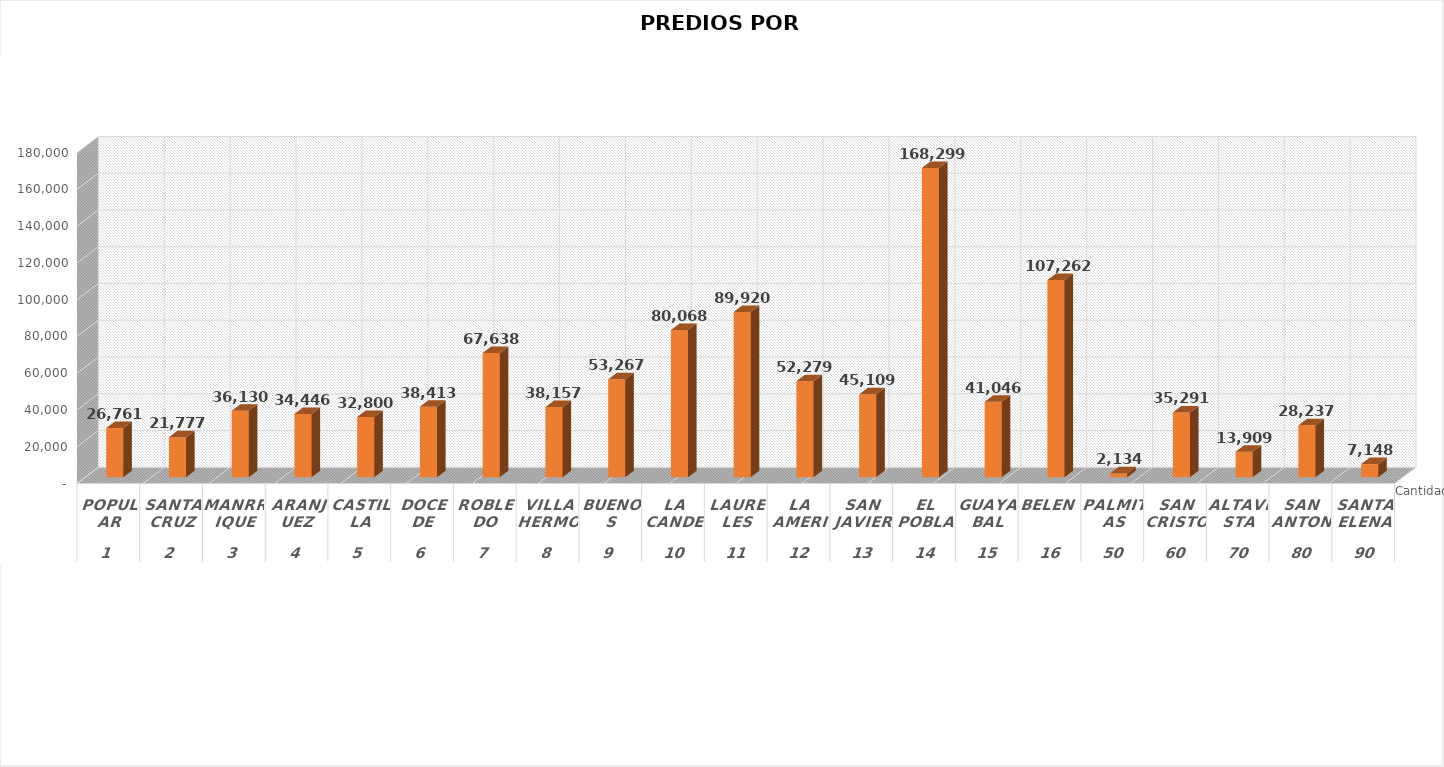
| Category | Cantidad de Predios |
|---|---|
| 0 | 26761 |
| 1 | 21777 |
| 2 | 36130 |
| 3 | 34446 |
| 4 | 32800 |
| 5 | 38413 |
| 6 | 67638 |
| 7 | 38157 |
| 8 | 53267 |
| 9 | 80068 |
| 10 | 89920 |
| 11 | 52279 |
| 12 | 45109 |
| 13 | 168299 |
| 14 | 41046 |
| 15 | 107262 |
| 16 | 2134 |
| 17 | 35291 |
| 18 | 13909 |
| 19 | 28237 |
| 20 | 7148 |